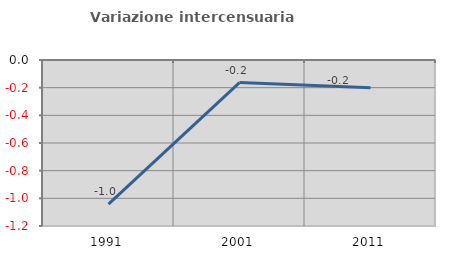
| Category | Variazione intercensuaria annua |
|---|---|
| 1991.0 | -1.042 |
| 2001.0 | -0.164 |
| 2011.0 | -0.2 |